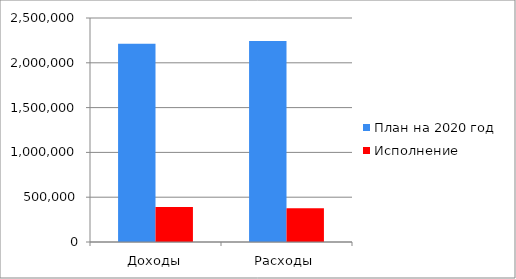
| Category | План на 2020 год | Исполнение |
|---|---|---|
| Доходы | 2213597 | 389542 |
| Расходы | 2244357 | 376653 |